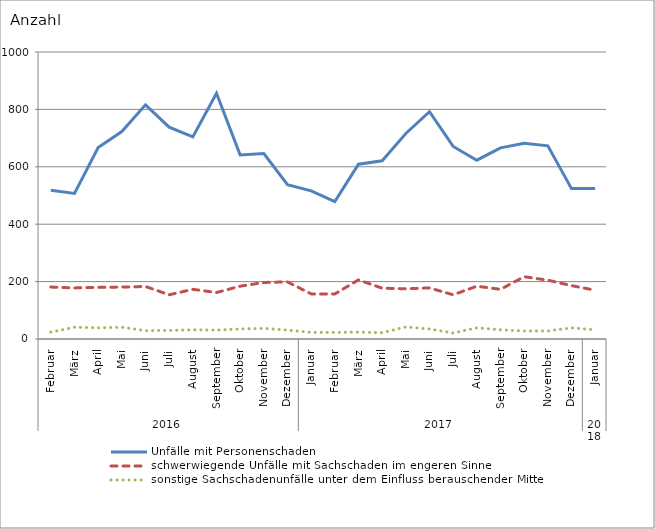
| Category | Unfälle mit Personenschaden | schwerwiegende Unfälle mit Sachschaden im engeren Sinne | sonstige Sachschadenunfälle unter dem Einfluss berauschender Mittel |
|---|---|---|---|
| 0 | 518 | 181 | 24 |
| 1 | 507 | 178 | 41 |
| 2 | 667 | 180 | 39 |
| 3 | 723 | 181 | 41 |
| 4 | 816 | 183 | 29 |
| 5 | 738 | 154 | 30 |
| 6 | 704 | 173 | 32 |
| 7 | 856 | 162 | 31 |
| 8 | 641 | 184 | 35 |
| 9 | 646 | 197 | 37 |
| 10 | 538 | 199 | 31 |
| 11 | 516 | 157 | 23 |
| 12 | 479 | 157 | 23 |
| 13 | 609 | 206 | 24 |
| 14 | 621 | 177 | 22 |
| 15 | 716 | 175 | 42 |
| 16 | 792 | 178 | 35 |
| 17 | 671 | 154 | 21 |
| 18 | 623 | 184 | 39 |
| 19 | 666 | 173 | 32 |
| 20 | 682 | 217 | 28 |
| 21 | 673 | 205 | 28 |
| 22 | 524 | 186 | 39 |
| 23 | 524 | 170 | 32 |